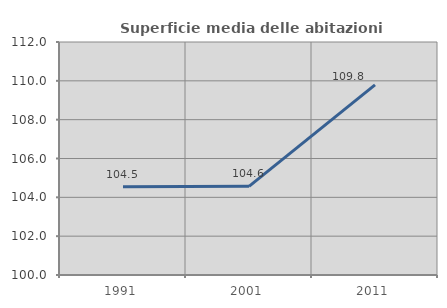
| Category | Superficie media delle abitazioni occupate |
|---|---|
| 1991.0 | 104.543 |
| 2001.0 | 104.566 |
| 2011.0 | 109.788 |